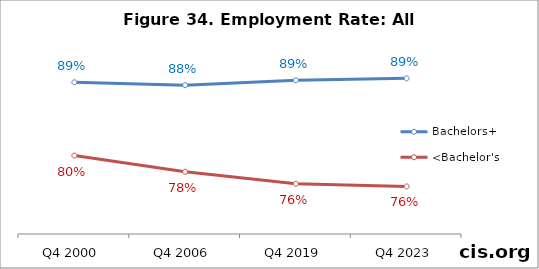
| Category | Bachelors+ | <Bachelor's |
|---|---|---|
| Q4 2000 | 0.888 | 0.797 |
| Q4 2006 | 0.884 | 0.777 |
| Q4 2019 | 0.89 | 0.762 |
| Q4 2023 | 0.893 | 0.759 |